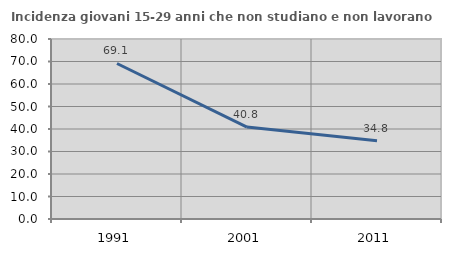
| Category | Incidenza giovani 15-29 anni che non studiano e non lavorano  |
|---|---|
| 1991.0 | 69.113 |
| 2001.0 | 40.842 |
| 2011.0 | 34.813 |